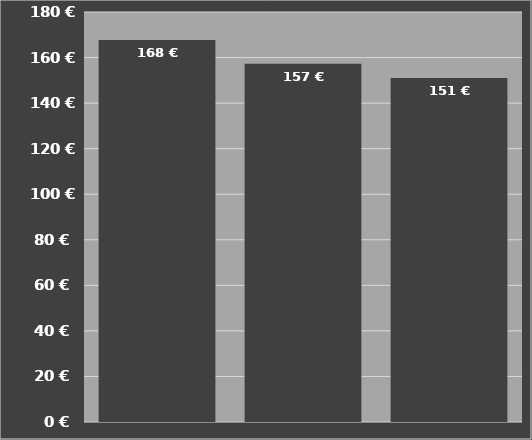
| Category | Kosten je Stunde |
|---|---|
| Container 58 m³
mit Pumpstation | 167.667 |
| Container 58 m³
mit Pumpstation | 157.241 |